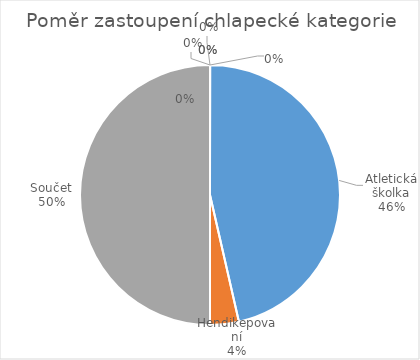
| Category | Series 0 |
|---|---|
| Atletická školka | 13 |
| Hendikepovaní | 1 |
| Součet | 14 |